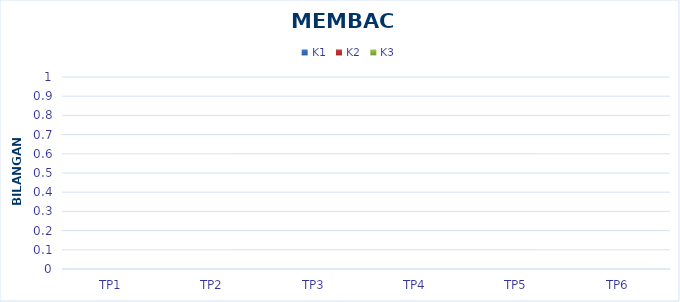
| Category | K1 | K2 | K3 |
|---|---|---|---|
| TP1 | 0 | 0 | 0 |
| TP2 | 0 | 0 | 0 |
| TP3 | 0 | 0 | 0 |
| TP4 | 0 | 0 | 0 |
| TP5 | 0 | 0 | 0 |
| TP6 | 0 | 0 | 0 |